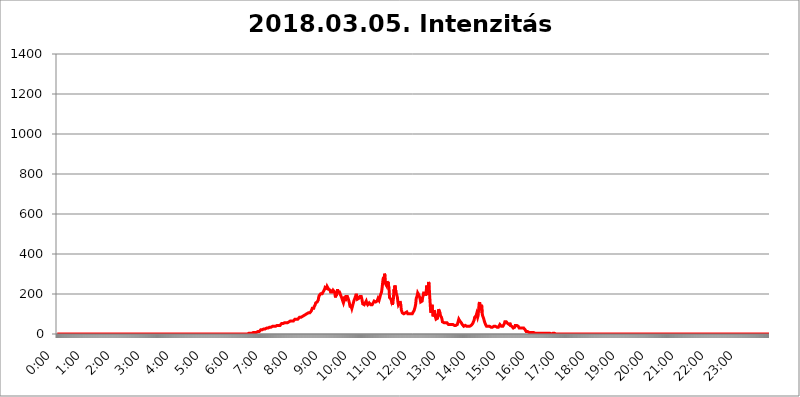
| Category | 2018.03.05. Intenzitás [W/m^2] |
|---|---|
| 0.0 | 0 |
| 0.0006944444444444445 | 0 |
| 0.001388888888888889 | 0 |
| 0.0020833333333333333 | 0 |
| 0.002777777777777778 | 0 |
| 0.003472222222222222 | 0 |
| 0.004166666666666667 | 0 |
| 0.004861111111111111 | 0 |
| 0.005555555555555556 | 0 |
| 0.0062499999999999995 | 0 |
| 0.006944444444444444 | 0 |
| 0.007638888888888889 | 0 |
| 0.008333333333333333 | 0 |
| 0.009027777777777779 | 0 |
| 0.009722222222222222 | 0 |
| 0.010416666666666666 | 0 |
| 0.011111111111111112 | 0 |
| 0.011805555555555555 | 0 |
| 0.012499999999999999 | 0 |
| 0.013194444444444444 | 0 |
| 0.013888888888888888 | 0 |
| 0.014583333333333332 | 0 |
| 0.015277777777777777 | 0 |
| 0.015972222222222224 | 0 |
| 0.016666666666666666 | 0 |
| 0.017361111111111112 | 0 |
| 0.018055555555555557 | 0 |
| 0.01875 | 0 |
| 0.019444444444444445 | 0 |
| 0.02013888888888889 | 0 |
| 0.020833333333333332 | 0 |
| 0.02152777777777778 | 0 |
| 0.022222222222222223 | 0 |
| 0.02291666666666667 | 0 |
| 0.02361111111111111 | 0 |
| 0.024305555555555556 | 0 |
| 0.024999999999999998 | 0 |
| 0.025694444444444447 | 0 |
| 0.02638888888888889 | 0 |
| 0.027083333333333334 | 0 |
| 0.027777777777777776 | 0 |
| 0.02847222222222222 | 0 |
| 0.029166666666666664 | 0 |
| 0.029861111111111113 | 0 |
| 0.030555555555555555 | 0 |
| 0.03125 | 0 |
| 0.03194444444444445 | 0 |
| 0.03263888888888889 | 0 |
| 0.03333333333333333 | 0 |
| 0.034027777777777775 | 0 |
| 0.034722222222222224 | 0 |
| 0.035416666666666666 | 0 |
| 0.036111111111111115 | 0 |
| 0.03680555555555556 | 0 |
| 0.0375 | 0 |
| 0.03819444444444444 | 0 |
| 0.03888888888888889 | 0 |
| 0.03958333333333333 | 0 |
| 0.04027777777777778 | 0 |
| 0.04097222222222222 | 0 |
| 0.041666666666666664 | 0 |
| 0.042361111111111106 | 0 |
| 0.04305555555555556 | 0 |
| 0.043750000000000004 | 0 |
| 0.044444444444444446 | 0 |
| 0.04513888888888889 | 0 |
| 0.04583333333333334 | 0 |
| 0.04652777777777778 | 0 |
| 0.04722222222222222 | 0 |
| 0.04791666666666666 | 0 |
| 0.04861111111111111 | 0 |
| 0.049305555555555554 | 0 |
| 0.049999999999999996 | 0 |
| 0.05069444444444445 | 0 |
| 0.051388888888888894 | 0 |
| 0.052083333333333336 | 0 |
| 0.05277777777777778 | 0 |
| 0.05347222222222222 | 0 |
| 0.05416666666666667 | 0 |
| 0.05486111111111111 | 0 |
| 0.05555555555555555 | 0 |
| 0.05625 | 0 |
| 0.05694444444444444 | 0 |
| 0.057638888888888885 | 0 |
| 0.05833333333333333 | 0 |
| 0.05902777777777778 | 0 |
| 0.059722222222222225 | 0 |
| 0.06041666666666667 | 0 |
| 0.061111111111111116 | 0 |
| 0.06180555555555556 | 0 |
| 0.0625 | 0 |
| 0.06319444444444444 | 0 |
| 0.06388888888888888 | 0 |
| 0.06458333333333334 | 0 |
| 0.06527777777777778 | 0 |
| 0.06597222222222222 | 0 |
| 0.06666666666666667 | 0 |
| 0.06736111111111111 | 0 |
| 0.06805555555555555 | 0 |
| 0.06874999999999999 | 0 |
| 0.06944444444444443 | 0 |
| 0.07013888888888889 | 0 |
| 0.07083333333333333 | 0 |
| 0.07152777777777779 | 0 |
| 0.07222222222222223 | 0 |
| 0.07291666666666667 | 0 |
| 0.07361111111111111 | 0 |
| 0.07430555555555556 | 0 |
| 0.075 | 0 |
| 0.07569444444444444 | 0 |
| 0.0763888888888889 | 0 |
| 0.07708333333333334 | 0 |
| 0.07777777777777778 | 0 |
| 0.07847222222222222 | 0 |
| 0.07916666666666666 | 0 |
| 0.0798611111111111 | 0 |
| 0.08055555555555556 | 0 |
| 0.08125 | 0 |
| 0.08194444444444444 | 0 |
| 0.08263888888888889 | 0 |
| 0.08333333333333333 | 0 |
| 0.08402777777777777 | 0 |
| 0.08472222222222221 | 0 |
| 0.08541666666666665 | 0 |
| 0.08611111111111112 | 0 |
| 0.08680555555555557 | 0 |
| 0.08750000000000001 | 0 |
| 0.08819444444444445 | 0 |
| 0.08888888888888889 | 0 |
| 0.08958333333333333 | 0 |
| 0.09027777777777778 | 0 |
| 0.09097222222222222 | 0 |
| 0.09166666666666667 | 0 |
| 0.09236111111111112 | 0 |
| 0.09305555555555556 | 0 |
| 0.09375 | 0 |
| 0.09444444444444444 | 0 |
| 0.09513888888888888 | 0 |
| 0.09583333333333333 | 0 |
| 0.09652777777777777 | 0 |
| 0.09722222222222222 | 0 |
| 0.09791666666666667 | 0 |
| 0.09861111111111111 | 0 |
| 0.09930555555555555 | 0 |
| 0.09999999999999999 | 0 |
| 0.10069444444444443 | 0 |
| 0.1013888888888889 | 0 |
| 0.10208333333333335 | 0 |
| 0.10277777777777779 | 0 |
| 0.10347222222222223 | 0 |
| 0.10416666666666667 | 0 |
| 0.10486111111111111 | 0 |
| 0.10555555555555556 | 0 |
| 0.10625 | 0 |
| 0.10694444444444444 | 0 |
| 0.1076388888888889 | 0 |
| 0.10833333333333334 | 0 |
| 0.10902777777777778 | 0 |
| 0.10972222222222222 | 0 |
| 0.1111111111111111 | 0 |
| 0.11180555555555556 | 0 |
| 0.11180555555555556 | 0 |
| 0.1125 | 0 |
| 0.11319444444444444 | 0 |
| 0.11388888888888889 | 0 |
| 0.11458333333333333 | 0 |
| 0.11527777777777777 | 0 |
| 0.11597222222222221 | 0 |
| 0.11666666666666665 | 0 |
| 0.1173611111111111 | 0 |
| 0.11805555555555557 | 0 |
| 0.11944444444444445 | 0 |
| 0.12013888888888889 | 0 |
| 0.12083333333333333 | 0 |
| 0.12152777777777778 | 0 |
| 0.12222222222222223 | 0 |
| 0.12291666666666667 | 0 |
| 0.12291666666666667 | 0 |
| 0.12361111111111112 | 0 |
| 0.12430555555555556 | 0 |
| 0.125 | 0 |
| 0.12569444444444444 | 0 |
| 0.12638888888888888 | 0 |
| 0.12708333333333333 | 0 |
| 0.16875 | 0 |
| 0.12847222222222224 | 0 |
| 0.12916666666666668 | 0 |
| 0.12986111111111112 | 0 |
| 0.13055555555555556 | 0 |
| 0.13125 | 0 |
| 0.13194444444444445 | 0 |
| 0.1326388888888889 | 0 |
| 0.13333333333333333 | 0 |
| 0.13402777777777777 | 0 |
| 0.13402777777777777 | 0 |
| 0.13472222222222222 | 0 |
| 0.13541666666666666 | 0 |
| 0.1361111111111111 | 0 |
| 0.13749999999999998 | 0 |
| 0.13819444444444443 | 0 |
| 0.1388888888888889 | 0 |
| 0.13958333333333334 | 0 |
| 0.14027777777777778 | 0 |
| 0.14097222222222222 | 0 |
| 0.14166666666666666 | 0 |
| 0.1423611111111111 | 0 |
| 0.14305555555555557 | 0 |
| 0.14375000000000002 | 0 |
| 0.14444444444444446 | 0 |
| 0.1451388888888889 | 0 |
| 0.1451388888888889 | 0 |
| 0.14652777777777778 | 0 |
| 0.14722222222222223 | 0 |
| 0.14791666666666667 | 0 |
| 0.1486111111111111 | 0 |
| 0.14930555555555555 | 0 |
| 0.15 | 0 |
| 0.15069444444444444 | 0 |
| 0.15138888888888888 | 0 |
| 0.15208333333333332 | 0 |
| 0.15277777777777776 | 0 |
| 0.15347222222222223 | 0 |
| 0.15416666666666667 | 0 |
| 0.15486111111111112 | 0 |
| 0.15555555555555556 | 0 |
| 0.15625 | 0 |
| 0.15694444444444444 | 0 |
| 0.15763888888888888 | 0 |
| 0.15833333333333333 | 0 |
| 0.15902777777777777 | 0 |
| 0.15972222222222224 | 0 |
| 0.16041666666666668 | 0 |
| 0.16111111111111112 | 0 |
| 0.16180555555555556 | 0 |
| 0.1625 | 0 |
| 0.16319444444444445 | 0 |
| 0.1638888888888889 | 0 |
| 0.16458333333333333 | 0 |
| 0.16527777777777777 | 0 |
| 0.16597222222222222 | 0 |
| 0.16666666666666666 | 0 |
| 0.1673611111111111 | 0 |
| 0.16805555555555554 | 0 |
| 0.16874999999999998 | 0 |
| 0.16944444444444443 | 0 |
| 0.17013888888888887 | 0 |
| 0.1708333333333333 | 0 |
| 0.17152777777777775 | 0 |
| 0.17222222222222225 | 0 |
| 0.1729166666666667 | 0 |
| 0.17361111111111113 | 0 |
| 0.17430555555555557 | 0 |
| 0.17500000000000002 | 0 |
| 0.17569444444444446 | 0 |
| 0.1763888888888889 | 0 |
| 0.17708333333333334 | 0 |
| 0.17777777777777778 | 0 |
| 0.17847222222222223 | 0 |
| 0.17916666666666667 | 0 |
| 0.1798611111111111 | 0 |
| 0.18055555555555555 | 0 |
| 0.18125 | 0 |
| 0.18194444444444444 | 0 |
| 0.1826388888888889 | 0 |
| 0.18333333333333335 | 0 |
| 0.1840277777777778 | 0 |
| 0.18472222222222223 | 0 |
| 0.18541666666666667 | 0 |
| 0.18611111111111112 | 0 |
| 0.18680555555555556 | 0 |
| 0.1875 | 0 |
| 0.18819444444444444 | 0 |
| 0.18888888888888888 | 0 |
| 0.18958333333333333 | 0 |
| 0.19027777777777777 | 0 |
| 0.1909722222222222 | 0 |
| 0.19166666666666665 | 0 |
| 0.19236111111111112 | 0 |
| 0.19305555555555554 | 0 |
| 0.19375 | 0 |
| 0.19444444444444445 | 0 |
| 0.1951388888888889 | 0 |
| 0.19583333333333333 | 0 |
| 0.19652777777777777 | 0 |
| 0.19722222222222222 | 0 |
| 0.19791666666666666 | 0 |
| 0.1986111111111111 | 0 |
| 0.19930555555555554 | 0 |
| 0.19999999999999998 | 0 |
| 0.20069444444444443 | 0 |
| 0.20138888888888887 | 0 |
| 0.2020833333333333 | 0 |
| 0.2027777777777778 | 0 |
| 0.2034722222222222 | 0 |
| 0.2041666666666667 | 0 |
| 0.20486111111111113 | 0 |
| 0.20555555555555557 | 0 |
| 0.20625000000000002 | 0 |
| 0.20694444444444446 | 0 |
| 0.2076388888888889 | 0 |
| 0.20833333333333334 | 0 |
| 0.20902777777777778 | 0 |
| 0.20972222222222223 | 0 |
| 0.21041666666666667 | 0 |
| 0.2111111111111111 | 0 |
| 0.21180555555555555 | 0 |
| 0.2125 | 0 |
| 0.21319444444444444 | 0 |
| 0.2138888888888889 | 0 |
| 0.21458333333333335 | 0 |
| 0.2152777777777778 | 0 |
| 0.21597222222222223 | 0 |
| 0.21666666666666667 | 0 |
| 0.21736111111111112 | 0 |
| 0.21805555555555556 | 0 |
| 0.21875 | 0 |
| 0.21944444444444444 | 0 |
| 0.22013888888888888 | 0 |
| 0.22083333333333333 | 0 |
| 0.22152777777777777 | 0 |
| 0.2222222222222222 | 0 |
| 0.22291666666666665 | 0 |
| 0.2236111111111111 | 0 |
| 0.22430555555555556 | 0 |
| 0.225 | 0 |
| 0.22569444444444445 | 0 |
| 0.2263888888888889 | 0 |
| 0.22708333333333333 | 0 |
| 0.22777777777777777 | 0 |
| 0.22847222222222222 | 0 |
| 0.22916666666666666 | 0 |
| 0.2298611111111111 | 0 |
| 0.23055555555555554 | 0 |
| 0.23124999999999998 | 0 |
| 0.23194444444444443 | 0 |
| 0.23263888888888887 | 0 |
| 0.2333333333333333 | 0 |
| 0.2340277777777778 | 0 |
| 0.2347222222222222 | 0 |
| 0.2354166666666667 | 0 |
| 0.23611111111111113 | 0 |
| 0.23680555555555557 | 0 |
| 0.23750000000000002 | 0 |
| 0.23819444444444446 | 0 |
| 0.2388888888888889 | 0 |
| 0.23958333333333334 | 0 |
| 0.24027777777777778 | 0 |
| 0.24097222222222223 | 0 |
| 0.24166666666666667 | 0 |
| 0.2423611111111111 | 0 |
| 0.24305555555555555 | 0 |
| 0.24375 | 0 |
| 0.24444444444444446 | 0 |
| 0.24513888888888888 | 0 |
| 0.24583333333333335 | 0 |
| 0.2465277777777778 | 0 |
| 0.24722222222222223 | 0 |
| 0.24791666666666667 | 0 |
| 0.24861111111111112 | 0 |
| 0.24930555555555556 | 0 |
| 0.25 | 0 |
| 0.25069444444444444 | 0 |
| 0.2513888888888889 | 0 |
| 0.2520833333333333 | 0 |
| 0.25277777777777777 | 0 |
| 0.2534722222222222 | 0 |
| 0.25416666666666665 | 0 |
| 0.2548611111111111 | 0 |
| 0.2555555555555556 | 0 |
| 0.25625000000000003 | 0 |
| 0.2569444444444445 | 0 |
| 0.2576388888888889 | 0 |
| 0.25833333333333336 | 0 |
| 0.2590277777777778 | 0 |
| 0.25972222222222224 | 0 |
| 0.2604166666666667 | 0 |
| 0.2611111111111111 | 0 |
| 0.26180555555555557 | 0 |
| 0.2625 | 0 |
| 0.26319444444444445 | 0 |
| 0.2638888888888889 | 0 |
| 0.26458333333333334 | 0 |
| 0.2652777777777778 | 0 |
| 0.2659722222222222 | 0 |
| 0.26666666666666666 | 0 |
| 0.2673611111111111 | 3.525 |
| 0.26805555555555555 | 3.525 |
| 0.26875 | 3.525 |
| 0.26944444444444443 | 3.525 |
| 0.2701388888888889 | 3.525 |
| 0.2708333333333333 | 3.525 |
| 0.27152777777777776 | 3.525 |
| 0.2722222222222222 | 3.525 |
| 0.27291666666666664 | 3.525 |
| 0.2736111111111111 | 3.525 |
| 0.2743055555555555 | 3.525 |
| 0.27499999999999997 | 7.887 |
| 0.27569444444444446 | 7.887 |
| 0.27638888888888885 | 7.887 |
| 0.27708333333333335 | 7.887 |
| 0.2777777777777778 | 7.887 |
| 0.27847222222222223 | 7.887 |
| 0.2791666666666667 | 7.887 |
| 0.2798611111111111 | 12.257 |
| 0.28055555555555556 | 12.257 |
| 0.28125 | 12.257 |
| 0.28194444444444444 | 12.257 |
| 0.2826388888888889 | 12.257 |
| 0.2833333333333333 | 12.257 |
| 0.28402777777777777 | 16.636 |
| 0.2847222222222222 | 16.636 |
| 0.28541666666666665 | 21.024 |
| 0.28611111111111115 | 21.024 |
| 0.28680555555555554 | 21.024 |
| 0.28750000000000003 | 21.024 |
| 0.2881944444444445 | 21.024 |
| 0.2888888888888889 | 21.024 |
| 0.28958333333333336 | 25.419 |
| 0.2902777777777778 | 25.419 |
| 0.29097222222222224 | 25.419 |
| 0.2916666666666667 | 25.419 |
| 0.2923611111111111 | 25.419 |
| 0.29305555555555557 | 29.823 |
| 0.29375 | 29.823 |
| 0.29444444444444445 | 29.823 |
| 0.2951388888888889 | 29.823 |
| 0.29583333333333334 | 29.823 |
| 0.2965277777777778 | 29.823 |
| 0.2972222222222222 | 29.823 |
| 0.29791666666666666 | 34.234 |
| 0.2986111111111111 | 34.234 |
| 0.29930555555555555 | 34.234 |
| 0.3 | 34.234 |
| 0.30069444444444443 | 38.653 |
| 0.3013888888888889 | 38.653 |
| 0.3020833333333333 | 38.653 |
| 0.30277777777777776 | 38.653 |
| 0.3034722222222222 | 38.653 |
| 0.30416666666666664 | 38.653 |
| 0.3048611111111111 | 38.653 |
| 0.3055555555555555 | 38.653 |
| 0.30624999999999997 | 38.653 |
| 0.3069444444444444 | 43.079 |
| 0.3076388888888889 | 43.079 |
| 0.30833333333333335 | 43.079 |
| 0.3090277777777778 | 43.079 |
| 0.30972222222222223 | 43.079 |
| 0.3104166666666667 | 43.079 |
| 0.3111111111111111 | 43.079 |
| 0.31180555555555556 | 43.079 |
| 0.3125 | 43.079 |
| 0.31319444444444444 | 47.511 |
| 0.3138888888888889 | 47.511 |
| 0.3145833333333333 | 51.951 |
| 0.31527777777777777 | 51.951 |
| 0.3159722222222222 | 51.951 |
| 0.31666666666666665 | 51.951 |
| 0.31736111111111115 | 51.951 |
| 0.31805555555555554 | 51.951 |
| 0.31875000000000003 | 56.398 |
| 0.3194444444444445 | 56.398 |
| 0.3201388888888889 | 56.398 |
| 0.32083333333333336 | 56.398 |
| 0.3215277777777778 | 56.398 |
| 0.32222222222222224 | 56.398 |
| 0.3229166666666667 | 56.398 |
| 0.3236111111111111 | 56.398 |
| 0.32430555555555557 | 60.85 |
| 0.325 | 60.85 |
| 0.32569444444444445 | 60.85 |
| 0.3263888888888889 | 60.85 |
| 0.32708333333333334 | 65.31 |
| 0.3277777777777778 | 65.31 |
| 0.3284722222222222 | 65.31 |
| 0.32916666666666666 | 65.31 |
| 0.3298611111111111 | 65.31 |
| 0.33055555555555555 | 65.31 |
| 0.33125 | 65.31 |
| 0.33194444444444443 | 69.775 |
| 0.3326388888888889 | 69.775 |
| 0.3333333333333333 | 74.246 |
| 0.3340277777777778 | 74.246 |
| 0.3347222222222222 | 74.246 |
| 0.3354166666666667 | 74.246 |
| 0.3361111111111111 | 78.722 |
| 0.3368055555555556 | 74.246 |
| 0.33749999999999997 | 74.246 |
| 0.33819444444444446 | 78.722 |
| 0.33888888888888885 | 78.722 |
| 0.33958333333333335 | 83.205 |
| 0.34027777777777773 | 83.205 |
| 0.34097222222222223 | 87.692 |
| 0.3416666666666666 | 83.205 |
| 0.3423611111111111 | 83.205 |
| 0.3430555555555555 | 87.692 |
| 0.34375 | 87.692 |
| 0.3444444444444445 | 87.692 |
| 0.3451388888888889 | 92.184 |
| 0.3458333333333334 | 92.184 |
| 0.34652777777777777 | 92.184 |
| 0.34722222222222227 | 92.184 |
| 0.34791666666666665 | 96.682 |
| 0.34861111111111115 | 101.184 |
| 0.34930555555555554 | 101.184 |
| 0.35000000000000003 | 101.184 |
| 0.3506944444444444 | 101.184 |
| 0.3513888888888889 | 101.184 |
| 0.3520833333333333 | 105.69 |
| 0.3527777777777778 | 110.201 |
| 0.3534722222222222 | 110.201 |
| 0.3541666666666667 | 105.69 |
| 0.3548611111111111 | 105.69 |
| 0.35555555555555557 | 110.201 |
| 0.35625 | 114.716 |
| 0.35694444444444445 | 119.235 |
| 0.3576388888888889 | 128.284 |
| 0.35833333333333334 | 123.758 |
| 0.3590277777777778 | 128.284 |
| 0.3597222222222222 | 128.284 |
| 0.36041666666666666 | 137.347 |
| 0.3611111111111111 | 137.347 |
| 0.36180555555555555 | 146.423 |
| 0.3625 | 155.509 |
| 0.36319444444444443 | 155.509 |
| 0.3638888888888889 | 155.509 |
| 0.3645833333333333 | 160.056 |
| 0.3652777777777778 | 164.605 |
| 0.3659722222222222 | 169.156 |
| 0.3666666666666667 | 182.82 |
| 0.3673611111111111 | 191.937 |
| 0.3680555555555556 | 196.497 |
| 0.36874999999999997 | 196.497 |
| 0.36944444444444446 | 201.058 |
| 0.37013888888888885 | 196.497 |
| 0.37083333333333335 | 201.058 |
| 0.37152777777777773 | 201.058 |
| 0.37222222222222223 | 201.058 |
| 0.3729166666666666 | 210.182 |
| 0.3736111111111111 | 214.746 |
| 0.3743055555555555 | 214.746 |
| 0.375 | 223.873 |
| 0.3756944444444445 | 233 |
| 0.3763888888888889 | 233 |
| 0.3770833333333334 | 228.436 |
| 0.37777777777777777 | 228.436 |
| 0.37847222222222227 | 237.564 |
| 0.37916666666666665 | 237.564 |
| 0.37986111111111115 | 233 |
| 0.38055555555555554 | 223.873 |
| 0.38125000000000003 | 223.873 |
| 0.3819444444444444 | 219.309 |
| 0.3826388888888889 | 219.309 |
| 0.3833333333333333 | 210.182 |
| 0.3840277777777778 | 210.182 |
| 0.3847222222222222 | 214.746 |
| 0.3854166666666667 | 210.182 |
| 0.3861111111111111 | 214.746 |
| 0.38680555555555557 | 219.309 |
| 0.3875 | 219.309 |
| 0.38819444444444445 | 214.746 |
| 0.3888888888888889 | 210.182 |
| 0.38958333333333334 | 205.62 |
| 0.3902777777777778 | 182.82 |
| 0.3909722222222222 | 201.058 |
| 0.39166666666666666 | 191.937 |
| 0.3923611111111111 | 205.62 |
| 0.39305555555555555 | 223.873 |
| 0.39375 | 210.182 |
| 0.39444444444444443 | 214.746 |
| 0.3951388888888889 | 205.62 |
| 0.3958333333333333 | 210.182 |
| 0.3965277777777778 | 210.182 |
| 0.3972222222222222 | 196.497 |
| 0.3979166666666667 | 191.937 |
| 0.3986111111111111 | 191.937 |
| 0.3993055555555556 | 178.264 |
| 0.39999999999999997 | 169.156 |
| 0.40069444444444446 | 164.605 |
| 0.40138888888888885 | 155.509 |
| 0.40208333333333335 | 164.605 |
| 0.40277777777777773 | 187.378 |
| 0.40347222222222223 | 182.82 |
| 0.4041666666666666 | 164.605 |
| 0.4048611111111111 | 187.378 |
| 0.4055555555555555 | 182.82 |
| 0.40625 | 187.378 |
| 0.4069444444444445 | 187.378 |
| 0.4076388888888889 | 187.378 |
| 0.4083333333333334 | 173.709 |
| 0.40902777777777777 | 164.605 |
| 0.40972222222222227 | 155.509 |
| 0.41041666666666665 | 141.884 |
| 0.41111111111111115 | 132.814 |
| 0.41180555555555554 | 146.423 |
| 0.41250000000000003 | 141.884 |
| 0.4131944444444444 | 128.284 |
| 0.4138888888888889 | 128.284 |
| 0.4145833333333333 | 128.284 |
| 0.4152777777777778 | 155.509 |
| 0.4159722222222222 | 164.605 |
| 0.4166666666666667 | 164.605 |
| 0.4173611111111111 | 178.264 |
| 0.41805555555555557 | 182.82 |
| 0.41875 | 191.937 |
| 0.41944444444444445 | 201.058 |
| 0.4201388888888889 | 182.82 |
| 0.42083333333333334 | 173.709 |
| 0.4215277777777778 | 169.156 |
| 0.4222222222222222 | 173.709 |
| 0.42291666666666666 | 178.264 |
| 0.4236111111111111 | 182.82 |
| 0.42430555555555555 | 187.378 |
| 0.425 | 191.937 |
| 0.42569444444444443 | 182.82 |
| 0.4263888888888889 | 187.378 |
| 0.4270833333333333 | 178.264 |
| 0.4277777777777778 | 164.605 |
| 0.4284722222222222 | 150.964 |
| 0.4291666666666667 | 150.964 |
| 0.4298611111111111 | 150.964 |
| 0.4305555555555556 | 146.423 |
| 0.43124999999999997 | 150.964 |
| 0.43194444444444446 | 155.509 |
| 0.43263888888888885 | 160.056 |
| 0.43333333333333335 | 164.605 |
| 0.43402777777777773 | 155.509 |
| 0.43472222222222223 | 150.964 |
| 0.4354166666666666 | 146.423 |
| 0.4361111111111111 | 146.423 |
| 0.4368055555555555 | 146.423 |
| 0.4375 | 155.509 |
| 0.4381944444444445 | 160.056 |
| 0.4388888888888889 | 150.964 |
| 0.4395833333333334 | 146.423 |
| 0.44027777777777777 | 141.884 |
| 0.44097222222222227 | 146.423 |
| 0.44166666666666665 | 146.423 |
| 0.44236111111111115 | 146.423 |
| 0.44305555555555554 | 155.509 |
| 0.44375000000000003 | 160.056 |
| 0.4444444444444444 | 164.605 |
| 0.4451388888888889 | 164.605 |
| 0.4458333333333333 | 169.156 |
| 0.4465277777777778 | 160.056 |
| 0.4472222222222222 | 164.605 |
| 0.4479166666666667 | 164.605 |
| 0.4486111111111111 | 164.605 |
| 0.44930555555555557 | 169.156 |
| 0.45 | 178.264 |
| 0.45069444444444445 | 178.264 |
| 0.4513888888888889 | 169.156 |
| 0.45208333333333334 | 164.605 |
| 0.4527777777777778 | 187.378 |
| 0.4534722222222222 | 196.497 |
| 0.45416666666666666 | 196.497 |
| 0.4548611111111111 | 210.182 |
| 0.45555555555555555 | 228.436 |
| 0.45625 | 251.251 |
| 0.45694444444444443 | 274.047 |
| 0.4576388888888889 | 283.156 |
| 0.4583333333333333 | 260.373 |
| 0.4590277777777778 | 301.354 |
| 0.4597222222222222 | 287.709 |
| 0.4604166666666667 | 251.251 |
| 0.4611111111111111 | 246.689 |
| 0.4618055555555556 | 242.127 |
| 0.46249999999999997 | 264.932 |
| 0.46319444444444446 | 242.127 |
| 0.46388888888888885 | 260.373 |
| 0.46458333333333335 | 242.127 |
| 0.46527777777777773 | 233 |
| 0.46597222222222223 | 182.82 |
| 0.4666666666666666 | 178.264 |
| 0.4673611111111111 | 182.82 |
| 0.4680555555555555 | 173.709 |
| 0.46875 | 164.605 |
| 0.4694444444444445 | 173.709 |
| 0.4701388888888889 | 146.423 |
| 0.4708333333333334 | 160.056 |
| 0.47152777777777777 | 178.264 |
| 0.47222222222222227 | 223.873 |
| 0.47291666666666665 | 214.746 |
| 0.47361111111111115 | 242.127 |
| 0.47430555555555554 | 242.127 |
| 0.47500000000000003 | 210.182 |
| 0.4756944444444444 | 201.058 |
| 0.4763888888888889 | 196.497 |
| 0.4770833333333333 | 182.82 |
| 0.4777777777777778 | 160.056 |
| 0.4784722222222222 | 146.423 |
| 0.4791666666666667 | 146.423 |
| 0.4798611111111111 | 155.509 |
| 0.48055555555555557 | 164.605 |
| 0.48125 | 164.605 |
| 0.48194444444444445 | 141.884 |
| 0.4826388888888889 | 119.235 |
| 0.48333333333333334 | 114.716 |
| 0.4840277777777778 | 105.69 |
| 0.4847222222222222 | 101.184 |
| 0.48541666666666666 | 101.184 |
| 0.4861111111111111 | 101.184 |
| 0.48680555555555555 | 105.69 |
| 0.4875 | 105.69 |
| 0.48819444444444443 | 105.69 |
| 0.4888888888888889 | 110.201 |
| 0.4895833333333333 | 110.201 |
| 0.4902777777777778 | 110.201 |
| 0.4909722222222222 | 105.69 |
| 0.4916666666666667 | 101.184 |
| 0.4923611111111111 | 101.184 |
| 0.4930555555555556 | 105.69 |
| 0.49374999999999997 | 101.184 |
| 0.49444444444444446 | 101.184 |
| 0.49513888888888885 | 96.682 |
| 0.49583333333333335 | 101.184 |
| 0.49652777777777773 | 96.682 |
| 0.49722222222222223 | 96.682 |
| 0.4979166666666666 | 101.184 |
| 0.4986111111111111 | 105.69 |
| 0.4993055555555555 | 110.201 |
| 0.5 | 114.716 |
| 0.5006944444444444 | 119.235 |
| 0.5013888888888889 | 123.758 |
| 0.5020833333333333 | 137.347 |
| 0.5027777777777778 | 150.964 |
| 0.5034722222222222 | 178.264 |
| 0.5041666666666667 | 182.82 |
| 0.5048611111111111 | 191.937 |
| 0.5055555555555555 | 205.62 |
| 0.50625 | 201.058 |
| 0.5069444444444444 | 196.497 |
| 0.5076388888888889 | 201.058 |
| 0.5083333333333333 | 182.82 |
| 0.5090277777777777 | 173.709 |
| 0.5097222222222222 | 160.056 |
| 0.5104166666666666 | 164.605 |
| 0.5111111111111112 | 164.605 |
| 0.5118055555555555 | 164.605 |
| 0.5125000000000001 | 182.82 |
| 0.5131944444444444 | 191.937 |
| 0.513888888888889 | 205.62 |
| 0.5145833333333333 | 205.62 |
| 0.5152777777777778 | 205.62 |
| 0.5159722222222222 | 205.62 |
| 0.5166666666666667 | 191.937 |
| 0.517361111111111 | 201.058 |
| 0.5180555555555556 | 242.127 |
| 0.5187499999999999 | 237.564 |
| 0.5194444444444445 | 196.497 |
| 0.5201388888888888 | 214.746 |
| 0.5208333333333334 | 260.373 |
| 0.5215277777777778 | 246.689 |
| 0.5222222222222223 | 196.497 |
| 0.5229166666666667 | 160.056 |
| 0.5236111111111111 | 119.235 |
| 0.5243055555555556 | 105.69 |
| 0.525 | 123.758 |
| 0.5256944444444445 | 146.423 |
| 0.5263888888888889 | 110.201 |
| 0.5270833333333333 | 87.692 |
| 0.5277777777777778 | 96.682 |
| 0.5284722222222222 | 119.235 |
| 0.5291666666666667 | 123.758 |
| 0.5298611111111111 | 96.682 |
| 0.5305555555555556 | 83.205 |
| 0.53125 | 74.246 |
| 0.5319444444444444 | 74.246 |
| 0.5326388888888889 | 74.246 |
| 0.5333333333333333 | 78.722 |
| 0.5340277777777778 | 92.184 |
| 0.5347222222222222 | 123.758 |
| 0.5354166666666667 | 128.284 |
| 0.5361111111111111 | 119.235 |
| 0.5368055555555555 | 105.69 |
| 0.5375 | 92.184 |
| 0.5381944444444444 | 92.184 |
| 0.5388888888888889 | 83.205 |
| 0.5395833333333333 | 74.246 |
| 0.5402777777777777 | 60.85 |
| 0.5409722222222222 | 56.398 |
| 0.5416666666666666 | 56.398 |
| 0.5423611111111112 | 56.398 |
| 0.5430555555555555 | 51.951 |
| 0.5437500000000001 | 51.951 |
| 0.5444444444444444 | 56.398 |
| 0.545138888888889 | 51.951 |
| 0.5458333333333333 | 51.951 |
| 0.5465277777777778 | 56.398 |
| 0.5472222222222222 | 56.398 |
| 0.5479166666666667 | 51.951 |
| 0.548611111111111 | 47.511 |
| 0.5493055555555556 | 47.511 |
| 0.5499999999999999 | 47.511 |
| 0.5506944444444445 | 47.511 |
| 0.5513888888888888 | 47.511 |
| 0.5520833333333334 | 47.511 |
| 0.5527777777777778 | 47.511 |
| 0.5534722222222223 | 47.511 |
| 0.5541666666666667 | 47.511 |
| 0.5548611111111111 | 47.511 |
| 0.5555555555555556 | 47.511 |
| 0.55625 | 43.079 |
| 0.5569444444444445 | 43.079 |
| 0.5576388888888889 | 38.653 |
| 0.5583333333333333 | 43.079 |
| 0.5590277777777778 | 43.079 |
| 0.5597222222222222 | 38.653 |
| 0.5604166666666667 | 43.079 |
| 0.5611111111111111 | 47.511 |
| 0.5618055555555556 | 56.398 |
| 0.5625 | 65.31 |
| 0.5631944444444444 | 74.246 |
| 0.5638888888888889 | 74.246 |
| 0.5645833333333333 | 65.31 |
| 0.5652777777777778 | 65.31 |
| 0.5659722222222222 | 69.775 |
| 0.5666666666666667 | 56.398 |
| 0.5673611111111111 | 56.398 |
| 0.5680555555555555 | 47.511 |
| 0.56875 | 43.079 |
| 0.5694444444444444 | 43.079 |
| 0.5701388888888889 | 38.653 |
| 0.5708333333333333 | 43.079 |
| 0.5715277777777777 | 43.079 |
| 0.5722222222222222 | 43.079 |
| 0.5729166666666666 | 38.653 |
| 0.5736111111111112 | 38.653 |
| 0.5743055555555555 | 38.653 |
| 0.5750000000000001 | 38.653 |
| 0.5756944444444444 | 34.234 |
| 0.576388888888889 | 38.653 |
| 0.5770833333333333 | 43.079 |
| 0.5777777777777778 | 38.653 |
| 0.5784722222222222 | 38.653 |
| 0.5791666666666667 | 43.079 |
| 0.579861111111111 | 43.079 |
| 0.5805555555555556 | 43.079 |
| 0.5812499999999999 | 43.079 |
| 0.5819444444444445 | 47.511 |
| 0.5826388888888888 | 51.951 |
| 0.5833333333333334 | 51.951 |
| 0.5840277777777778 | 56.398 |
| 0.5847222222222223 | 69.775 |
| 0.5854166666666667 | 83.205 |
| 0.5861111111111111 | 78.722 |
| 0.5868055555555556 | 83.205 |
| 0.5875 | 92.184 |
| 0.5881944444444445 | 101.184 |
| 0.5888888888888889 | 96.682 |
| 0.5895833333333333 | 83.205 |
| 0.5902777777777778 | 92.184 |
| 0.5909722222222222 | 96.682 |
| 0.5916666666666667 | 150.964 |
| 0.5923611111111111 | 160.056 |
| 0.5930555555555556 | 119.235 |
| 0.59375 | 114.716 |
| 0.5944444444444444 | 119.235 |
| 0.5951388888888889 | 146.423 |
| 0.5958333333333333 | 105.69 |
| 0.5965277777777778 | 92.184 |
| 0.5972222222222222 | 87.692 |
| 0.5979166666666667 | 78.722 |
| 0.5986111111111111 | 69.775 |
| 0.5993055555555555 | 60.85 |
| 0.6 | 56.398 |
| 0.6006944444444444 | 47.511 |
| 0.6013888888888889 | 43.079 |
| 0.6020833333333333 | 38.653 |
| 0.6027777777777777 | 38.653 |
| 0.6034722222222222 | 38.653 |
| 0.6041666666666666 | 38.653 |
| 0.6048611111111112 | 34.234 |
| 0.6055555555555555 | 38.653 |
| 0.6062500000000001 | 38.653 |
| 0.6069444444444444 | 34.234 |
| 0.607638888888889 | 34.234 |
| 0.6083333333333333 | 34.234 |
| 0.6090277777777778 | 34.234 |
| 0.6097222222222222 | 34.234 |
| 0.6104166666666667 | 34.234 |
| 0.611111111111111 | 34.234 |
| 0.6118055555555556 | 34.234 |
| 0.6124999999999999 | 38.653 |
| 0.6131944444444445 | 38.653 |
| 0.6138888888888888 | 38.653 |
| 0.6145833333333334 | 38.653 |
| 0.6152777777777778 | 38.653 |
| 0.6159722222222223 | 38.653 |
| 0.6166666666666667 | 34.234 |
| 0.6173611111111111 | 34.234 |
| 0.6180555555555556 | 34.234 |
| 0.61875 | 34.234 |
| 0.6194444444444445 | 34.234 |
| 0.6201388888888889 | 38.653 |
| 0.6208333333333333 | 47.511 |
| 0.6215277777777778 | 47.511 |
| 0.6222222222222222 | 43.079 |
| 0.6229166666666667 | 38.653 |
| 0.6236111111111111 | 34.234 |
| 0.6243055555555556 | 34.234 |
| 0.625 | 38.653 |
| 0.6256944444444444 | 38.653 |
| 0.6263888888888889 | 43.079 |
| 0.6270833333333333 | 51.951 |
| 0.6277777777777778 | 60.85 |
| 0.6284722222222222 | 65.31 |
| 0.6291666666666667 | 65.31 |
| 0.6298611111111111 | 60.85 |
| 0.6305555555555555 | 60.85 |
| 0.63125 | 56.398 |
| 0.6319444444444444 | 51.951 |
| 0.6326388888888889 | 51.951 |
| 0.6333333333333333 | 51.951 |
| 0.6340277777777777 | 47.511 |
| 0.6347222222222222 | 56.398 |
| 0.6354166666666666 | 43.079 |
| 0.6361111111111112 | 47.511 |
| 0.6368055555555555 | 43.079 |
| 0.6375000000000001 | 38.653 |
| 0.6381944444444444 | 38.653 |
| 0.638888888888889 | 38.653 |
| 0.6395833333333333 | 29.823 |
| 0.6402777777777778 | 29.823 |
| 0.6409722222222222 | 29.823 |
| 0.6416666666666667 | 34.234 |
| 0.642361111111111 | 43.079 |
| 0.6430555555555556 | 43.079 |
| 0.6437499999999999 | 43.079 |
| 0.6444444444444445 | 43.079 |
| 0.6451388888888888 | 43.079 |
| 0.6458333333333334 | 43.079 |
| 0.6465277777777778 | 38.653 |
| 0.6472222222222223 | 34.234 |
| 0.6479166666666667 | 29.823 |
| 0.6486111111111111 | 29.823 |
| 0.6493055555555556 | 29.823 |
| 0.65 | 29.823 |
| 0.6506944444444445 | 29.823 |
| 0.6513888888888889 | 29.823 |
| 0.6520833333333333 | 29.823 |
| 0.6527777777777778 | 29.823 |
| 0.6534722222222222 | 29.823 |
| 0.6541666666666667 | 29.823 |
| 0.6548611111111111 | 29.823 |
| 0.6555555555555556 | 25.419 |
| 0.65625 | 21.024 |
| 0.6569444444444444 | 16.636 |
| 0.6576388888888889 | 12.257 |
| 0.6583333333333333 | 16.636 |
| 0.6590277777777778 | 12.257 |
| 0.6597222222222222 | 12.257 |
| 0.6604166666666667 | 12.257 |
| 0.6611111111111111 | 12.257 |
| 0.6618055555555555 | 7.887 |
| 0.6625 | 7.887 |
| 0.6631944444444444 | 7.887 |
| 0.6638888888888889 | 7.887 |
| 0.6645833333333333 | 7.887 |
| 0.6652777777777777 | 7.887 |
| 0.6659722222222222 | 7.887 |
| 0.6666666666666666 | 7.887 |
| 0.6673611111111111 | 7.887 |
| 0.6680555555555556 | 7.887 |
| 0.6687500000000001 | 7.887 |
| 0.6694444444444444 | 7.887 |
| 0.6701388888888888 | 3.525 |
| 0.6708333333333334 | 3.525 |
| 0.6715277777777778 | 3.525 |
| 0.6722222222222222 | 3.525 |
| 0.6729166666666666 | 3.525 |
| 0.6736111111111112 | 3.525 |
| 0.6743055555555556 | 3.525 |
| 0.6749999999999999 | 3.525 |
| 0.6756944444444444 | 3.525 |
| 0.6763888888888889 | 3.525 |
| 0.6770833333333334 | 3.525 |
| 0.6777777777777777 | 3.525 |
| 0.6784722222222223 | 3.525 |
| 0.6791666666666667 | 3.525 |
| 0.6798611111111111 | 3.525 |
| 0.6805555555555555 | 3.525 |
| 0.68125 | 3.525 |
| 0.6819444444444445 | 3.525 |
| 0.6826388888888889 | 3.525 |
| 0.6833333333333332 | 3.525 |
| 0.6840277777777778 | 3.525 |
| 0.6847222222222222 | 3.525 |
| 0.6854166666666667 | 3.525 |
| 0.686111111111111 | 3.525 |
| 0.6868055555555556 | 3.525 |
| 0.6875 | 3.525 |
| 0.6881944444444444 | 3.525 |
| 0.688888888888889 | 3.525 |
| 0.6895833333333333 | 3.525 |
| 0.6902777777777778 | 3.525 |
| 0.6909722222222222 | 3.525 |
| 0.6916666666666668 | 0 |
| 0.6923611111111111 | 3.525 |
| 0.6930555555555555 | 0 |
| 0.69375 | 0 |
| 0.6944444444444445 | 0 |
| 0.6951388888888889 | 3.525 |
| 0.6958333333333333 | 3.525 |
| 0.6965277777777777 | 0 |
| 0.6972222222222223 | 3.525 |
| 0.6979166666666666 | 0 |
| 0.6986111111111111 | 3.525 |
| 0.6993055555555556 | 0 |
| 0.7000000000000001 | 0 |
| 0.7006944444444444 | 0 |
| 0.7013888888888888 | 0 |
| 0.7020833333333334 | 0 |
| 0.7027777777777778 | 0 |
| 0.7034722222222222 | 0 |
| 0.7041666666666666 | 0 |
| 0.7048611111111112 | 0 |
| 0.7055555555555556 | 0 |
| 0.7062499999999999 | 0 |
| 0.7069444444444444 | 0 |
| 0.7076388888888889 | 0 |
| 0.7083333333333334 | 0 |
| 0.7090277777777777 | 0 |
| 0.7097222222222223 | 0 |
| 0.7104166666666667 | 0 |
| 0.7111111111111111 | 0 |
| 0.7118055555555555 | 0 |
| 0.7125 | 0 |
| 0.7131944444444445 | 0 |
| 0.7138888888888889 | 0 |
| 0.7145833333333332 | 0 |
| 0.7152777777777778 | 0 |
| 0.7159722222222222 | 0 |
| 0.7166666666666667 | 0 |
| 0.717361111111111 | 0 |
| 0.7180555555555556 | 0 |
| 0.71875 | 0 |
| 0.7194444444444444 | 0 |
| 0.720138888888889 | 0 |
| 0.7208333333333333 | 0 |
| 0.7215277777777778 | 0 |
| 0.7222222222222222 | 0 |
| 0.7229166666666668 | 0 |
| 0.7236111111111111 | 0 |
| 0.7243055555555555 | 0 |
| 0.725 | 0 |
| 0.7256944444444445 | 0 |
| 0.7263888888888889 | 0 |
| 0.7270833333333333 | 0 |
| 0.7277777777777777 | 0 |
| 0.7284722222222223 | 0 |
| 0.7291666666666666 | 0 |
| 0.7298611111111111 | 0 |
| 0.7305555555555556 | 0 |
| 0.7312500000000001 | 0 |
| 0.7319444444444444 | 0 |
| 0.7326388888888888 | 0 |
| 0.7333333333333334 | 0 |
| 0.7340277777777778 | 0 |
| 0.7347222222222222 | 0 |
| 0.7354166666666666 | 0 |
| 0.7361111111111112 | 0 |
| 0.7368055555555556 | 0 |
| 0.7374999999999999 | 0 |
| 0.7381944444444444 | 0 |
| 0.7388888888888889 | 0 |
| 0.7395833333333334 | 0 |
| 0.7402777777777777 | 0 |
| 0.7409722222222223 | 0 |
| 0.7416666666666667 | 0 |
| 0.7423611111111111 | 0 |
| 0.7430555555555555 | 0 |
| 0.74375 | 0 |
| 0.7444444444444445 | 0 |
| 0.7451388888888889 | 0 |
| 0.7458333333333332 | 0 |
| 0.7465277777777778 | 0 |
| 0.7472222222222222 | 0 |
| 0.7479166666666667 | 0 |
| 0.748611111111111 | 0 |
| 0.7493055555555556 | 0 |
| 0.75 | 0 |
| 0.7506944444444444 | 0 |
| 0.751388888888889 | 0 |
| 0.7520833333333333 | 0 |
| 0.7527777777777778 | 0 |
| 0.7534722222222222 | 0 |
| 0.7541666666666668 | 0 |
| 0.7548611111111111 | 0 |
| 0.7555555555555555 | 0 |
| 0.75625 | 0 |
| 0.7569444444444445 | 0 |
| 0.7576388888888889 | 0 |
| 0.7583333333333333 | 0 |
| 0.7590277777777777 | 0 |
| 0.7597222222222223 | 0 |
| 0.7604166666666666 | 0 |
| 0.7611111111111111 | 0 |
| 0.7618055555555556 | 0 |
| 0.7625000000000001 | 0 |
| 0.7631944444444444 | 0 |
| 0.7638888888888888 | 0 |
| 0.7645833333333334 | 0 |
| 0.7652777777777778 | 0 |
| 0.7659722222222222 | 0 |
| 0.7666666666666666 | 0 |
| 0.7673611111111112 | 0 |
| 0.7680555555555556 | 0 |
| 0.7687499999999999 | 0 |
| 0.7694444444444444 | 0 |
| 0.7701388888888889 | 0 |
| 0.7708333333333334 | 0 |
| 0.7715277777777777 | 0 |
| 0.7722222222222223 | 0 |
| 0.7729166666666667 | 0 |
| 0.7736111111111111 | 0 |
| 0.7743055555555555 | 0 |
| 0.775 | 0 |
| 0.7756944444444445 | 0 |
| 0.7763888888888889 | 0 |
| 0.7770833333333332 | 0 |
| 0.7777777777777778 | 0 |
| 0.7784722222222222 | 0 |
| 0.7791666666666667 | 0 |
| 0.779861111111111 | 0 |
| 0.7805555555555556 | 0 |
| 0.78125 | 0 |
| 0.7819444444444444 | 0 |
| 0.782638888888889 | 0 |
| 0.7833333333333333 | 0 |
| 0.7840277777777778 | 0 |
| 0.7847222222222222 | 0 |
| 0.7854166666666668 | 0 |
| 0.7861111111111111 | 0 |
| 0.7868055555555555 | 0 |
| 0.7875 | 0 |
| 0.7881944444444445 | 0 |
| 0.7888888888888889 | 0 |
| 0.7895833333333333 | 0 |
| 0.7902777777777777 | 0 |
| 0.7909722222222223 | 0 |
| 0.7916666666666666 | 0 |
| 0.7923611111111111 | 0 |
| 0.7930555555555556 | 0 |
| 0.7937500000000001 | 0 |
| 0.7944444444444444 | 0 |
| 0.7951388888888888 | 0 |
| 0.7958333333333334 | 0 |
| 0.7965277777777778 | 0 |
| 0.7972222222222222 | 0 |
| 0.7979166666666666 | 0 |
| 0.7986111111111112 | 0 |
| 0.7993055555555556 | 0 |
| 0.7999999999999999 | 0 |
| 0.8006944444444444 | 0 |
| 0.8013888888888889 | 0 |
| 0.8020833333333334 | 0 |
| 0.8027777777777777 | 0 |
| 0.8034722222222223 | 0 |
| 0.8041666666666667 | 0 |
| 0.8048611111111111 | 0 |
| 0.8055555555555555 | 0 |
| 0.80625 | 0 |
| 0.8069444444444445 | 0 |
| 0.8076388888888889 | 0 |
| 0.8083333333333332 | 0 |
| 0.8090277777777778 | 0 |
| 0.8097222222222222 | 0 |
| 0.8104166666666667 | 0 |
| 0.811111111111111 | 0 |
| 0.8118055555555556 | 0 |
| 0.8125 | 0 |
| 0.8131944444444444 | 0 |
| 0.813888888888889 | 0 |
| 0.8145833333333333 | 0 |
| 0.8152777777777778 | 0 |
| 0.8159722222222222 | 0 |
| 0.8166666666666668 | 0 |
| 0.8173611111111111 | 0 |
| 0.8180555555555555 | 0 |
| 0.81875 | 0 |
| 0.8194444444444445 | 0 |
| 0.8201388888888889 | 0 |
| 0.8208333333333333 | 0 |
| 0.8215277777777777 | 0 |
| 0.8222222222222223 | 0 |
| 0.8229166666666666 | 0 |
| 0.8236111111111111 | 0 |
| 0.8243055555555556 | 0 |
| 0.8250000000000001 | 0 |
| 0.8256944444444444 | 0 |
| 0.8263888888888888 | 0 |
| 0.8270833333333334 | 0 |
| 0.8277777777777778 | 0 |
| 0.8284722222222222 | 0 |
| 0.8291666666666666 | 0 |
| 0.8298611111111112 | 0 |
| 0.8305555555555556 | 0 |
| 0.8312499999999999 | 0 |
| 0.8319444444444444 | 0 |
| 0.8326388888888889 | 0 |
| 0.8333333333333334 | 0 |
| 0.8340277777777777 | 0 |
| 0.8347222222222223 | 0 |
| 0.8354166666666667 | 0 |
| 0.8361111111111111 | 0 |
| 0.8368055555555555 | 0 |
| 0.8375 | 0 |
| 0.8381944444444445 | 0 |
| 0.8388888888888889 | 0 |
| 0.8395833333333332 | 0 |
| 0.8402777777777778 | 0 |
| 0.8409722222222222 | 0 |
| 0.8416666666666667 | 0 |
| 0.842361111111111 | 0 |
| 0.8430555555555556 | 0 |
| 0.84375 | 0 |
| 0.8444444444444444 | 0 |
| 0.845138888888889 | 0 |
| 0.8458333333333333 | 0 |
| 0.8465277777777778 | 0 |
| 0.8472222222222222 | 0 |
| 0.8479166666666668 | 0 |
| 0.8486111111111111 | 0 |
| 0.8493055555555555 | 0 |
| 0.85 | 0 |
| 0.8506944444444445 | 0 |
| 0.8513888888888889 | 0 |
| 0.8520833333333333 | 0 |
| 0.8527777777777777 | 0 |
| 0.8534722222222223 | 0 |
| 0.8541666666666666 | 0 |
| 0.8548611111111111 | 0 |
| 0.8555555555555556 | 0 |
| 0.8562500000000001 | 0 |
| 0.8569444444444444 | 0 |
| 0.8576388888888888 | 0 |
| 0.8583333333333334 | 0 |
| 0.8590277777777778 | 0 |
| 0.8597222222222222 | 0 |
| 0.8604166666666666 | 0 |
| 0.8611111111111112 | 0 |
| 0.8618055555555556 | 0 |
| 0.8624999999999999 | 0 |
| 0.8631944444444444 | 0 |
| 0.8638888888888889 | 0 |
| 0.8645833333333334 | 0 |
| 0.8652777777777777 | 0 |
| 0.8659722222222223 | 0 |
| 0.8666666666666667 | 0 |
| 0.8673611111111111 | 0 |
| 0.8680555555555555 | 0 |
| 0.86875 | 0 |
| 0.8694444444444445 | 0 |
| 0.8701388888888889 | 0 |
| 0.8708333333333332 | 0 |
| 0.8715277777777778 | 0 |
| 0.8722222222222222 | 0 |
| 0.8729166666666667 | 0 |
| 0.873611111111111 | 0 |
| 0.8743055555555556 | 0 |
| 0.875 | 0 |
| 0.8756944444444444 | 0 |
| 0.876388888888889 | 0 |
| 0.8770833333333333 | 0 |
| 0.8777777777777778 | 0 |
| 0.8784722222222222 | 0 |
| 0.8791666666666668 | 0 |
| 0.8798611111111111 | 0 |
| 0.8805555555555555 | 0 |
| 0.88125 | 0 |
| 0.8819444444444445 | 0 |
| 0.8826388888888889 | 0 |
| 0.8833333333333333 | 0 |
| 0.8840277777777777 | 0 |
| 0.8847222222222223 | 0 |
| 0.8854166666666666 | 0 |
| 0.8861111111111111 | 0 |
| 0.8868055555555556 | 0 |
| 0.8875000000000001 | 0 |
| 0.8881944444444444 | 0 |
| 0.8888888888888888 | 0 |
| 0.8895833333333334 | 0 |
| 0.8902777777777778 | 0 |
| 0.8909722222222222 | 0 |
| 0.8916666666666666 | 0 |
| 0.8923611111111112 | 0 |
| 0.8930555555555556 | 0 |
| 0.8937499999999999 | 0 |
| 0.8944444444444444 | 0 |
| 0.8951388888888889 | 0 |
| 0.8958333333333334 | 0 |
| 0.8965277777777777 | 0 |
| 0.8972222222222223 | 0 |
| 0.8979166666666667 | 0 |
| 0.8986111111111111 | 0 |
| 0.8993055555555555 | 0 |
| 0.9 | 0 |
| 0.9006944444444445 | 0 |
| 0.9013888888888889 | 0 |
| 0.9020833333333332 | 0 |
| 0.9027777777777778 | 0 |
| 0.9034722222222222 | 0 |
| 0.9041666666666667 | 0 |
| 0.904861111111111 | 0 |
| 0.9055555555555556 | 0 |
| 0.90625 | 0 |
| 0.9069444444444444 | 0 |
| 0.907638888888889 | 0 |
| 0.9083333333333333 | 0 |
| 0.9090277777777778 | 0 |
| 0.9097222222222222 | 0 |
| 0.9104166666666668 | 0 |
| 0.9111111111111111 | 0 |
| 0.9118055555555555 | 0 |
| 0.9125 | 0 |
| 0.9131944444444445 | 0 |
| 0.9138888888888889 | 0 |
| 0.9145833333333333 | 0 |
| 0.9152777777777777 | 0 |
| 0.9159722222222223 | 0 |
| 0.9166666666666666 | 0 |
| 0.9173611111111111 | 0 |
| 0.9180555555555556 | 0 |
| 0.9187500000000001 | 0 |
| 0.9194444444444444 | 0 |
| 0.9201388888888888 | 0 |
| 0.9208333333333334 | 0 |
| 0.9215277777777778 | 0 |
| 0.9222222222222222 | 0 |
| 0.9229166666666666 | 0 |
| 0.9236111111111112 | 0 |
| 0.9243055555555556 | 0 |
| 0.9249999999999999 | 0 |
| 0.9256944444444444 | 0 |
| 0.9263888888888889 | 0 |
| 0.9270833333333334 | 0 |
| 0.9277777777777777 | 0 |
| 0.9284722222222223 | 0 |
| 0.9291666666666667 | 0 |
| 0.9298611111111111 | 0 |
| 0.9305555555555555 | 0 |
| 0.93125 | 0 |
| 0.9319444444444445 | 0 |
| 0.9326388888888889 | 0 |
| 0.9333333333333332 | 0 |
| 0.9340277777777778 | 0 |
| 0.9347222222222222 | 0 |
| 0.9354166666666667 | 0 |
| 0.936111111111111 | 0 |
| 0.9368055555555556 | 0 |
| 0.9375 | 0 |
| 0.9381944444444444 | 0 |
| 0.938888888888889 | 0 |
| 0.9395833333333333 | 0 |
| 0.9402777777777778 | 0 |
| 0.9409722222222222 | 0 |
| 0.9416666666666668 | 0 |
| 0.9423611111111111 | 0 |
| 0.9430555555555555 | 0 |
| 0.94375 | 0 |
| 0.9444444444444445 | 0 |
| 0.9451388888888889 | 0 |
| 0.9458333333333333 | 0 |
| 0.9465277777777777 | 0 |
| 0.9472222222222223 | 0 |
| 0.9479166666666666 | 0 |
| 0.9486111111111111 | 0 |
| 0.9493055555555556 | 0 |
| 0.9500000000000001 | 0 |
| 0.9506944444444444 | 0 |
| 0.9513888888888888 | 0 |
| 0.9520833333333334 | 0 |
| 0.9527777777777778 | 0 |
| 0.9534722222222222 | 0 |
| 0.9541666666666666 | 0 |
| 0.9548611111111112 | 0 |
| 0.9555555555555556 | 0 |
| 0.9562499999999999 | 0 |
| 0.9569444444444444 | 0 |
| 0.9576388888888889 | 0 |
| 0.9583333333333334 | 0 |
| 0.9590277777777777 | 0 |
| 0.9597222222222223 | 0 |
| 0.9604166666666667 | 0 |
| 0.9611111111111111 | 0 |
| 0.9618055555555555 | 0 |
| 0.9625 | 0 |
| 0.9631944444444445 | 0 |
| 0.9638888888888889 | 0 |
| 0.9645833333333332 | 0 |
| 0.9652777777777778 | 0 |
| 0.9659722222222222 | 0 |
| 0.9666666666666667 | 0 |
| 0.967361111111111 | 0 |
| 0.9680555555555556 | 0 |
| 0.96875 | 0 |
| 0.9694444444444444 | 0 |
| 0.970138888888889 | 0 |
| 0.9708333333333333 | 0 |
| 0.9715277777777778 | 0 |
| 0.9722222222222222 | 0 |
| 0.9729166666666668 | 0 |
| 0.9736111111111111 | 0 |
| 0.9743055555555555 | 0 |
| 0.975 | 0 |
| 0.9756944444444445 | 0 |
| 0.9763888888888889 | 0 |
| 0.9770833333333333 | 0 |
| 0.9777777777777777 | 0 |
| 0.9784722222222223 | 0 |
| 0.9791666666666666 | 0 |
| 0.9798611111111111 | 0 |
| 0.9805555555555556 | 0 |
| 0.9812500000000001 | 0 |
| 0.9819444444444444 | 0 |
| 0.9826388888888888 | 0 |
| 0.9833333333333334 | 0 |
| 0.9840277777777778 | 0 |
| 0.9847222222222222 | 0 |
| 0.9854166666666666 | 0 |
| 0.9861111111111112 | 0 |
| 0.9868055555555556 | 0 |
| 0.9874999999999999 | 0 |
| 0.9881944444444444 | 0 |
| 0.9888888888888889 | 0 |
| 0.9895833333333334 | 0 |
| 0.9902777777777777 | 0 |
| 0.9909722222222223 | 0 |
| 0.9916666666666667 | 0 |
| 0.9923611111111111 | 0 |
| 0.9930555555555555 | 0 |
| 0.99375 | 0 |
| 0.9944444444444445 | 0 |
| 0.9951388888888889 | 0 |
| 0.9958333333333332 | 0 |
| 0.9965277777777778 | 0 |
| 0.9972222222222222 | 0 |
| 0.9979166666666667 | 0 |
| 0.998611111111111 | 0 |
| 0.9993055555555556 | 0 |